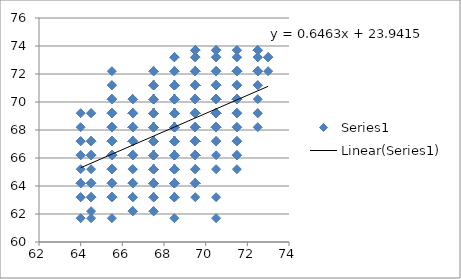
| Category | Series 0 |
|---|---|
| 70.5 | 61.7 |
| 68.5 | 61.7 |
| 65.5 | 61.7 |
| 64.5 | 61.7 |
| 64.0 | 61.7 |
| 67.5 | 62.2 |
| 67.5 | 62.2 |
| 67.5 | 62.2 |
| 66.5 | 62.2 |
| 66.5 | 62.2 |
| 66.5 | 62.2 |
| 64.5 | 62.2 |
| 70.5 | 63.2 |
| 69.5 | 63.2 |
| 68.5 | 63.2 |
| 68.5 | 63.2 |
| 68.5 | 63.2 |
| 68.5 | 63.2 |
| 68.5 | 63.2 |
| 68.5 | 63.2 |
| 68.5 | 63.2 |
| 67.5 | 63.2 |
| 67.5 | 63.2 |
| 67.5 | 63.2 |
| 67.5 | 63.2 |
| 67.5 | 63.2 |
| 66.5 | 63.2 |
| 66.5 | 63.2 |
| 66.5 | 63.2 |
| 65.5 | 63.2 |
| 65.5 | 63.2 |
| 65.5 | 63.2 |
| 65.5 | 63.2 |
| 65.5 | 63.2 |
| 65.5 | 63.2 |
| 65.5 | 63.2 |
| 65.5 | 63.2 |
| 65.5 | 63.2 |
| 64.5 | 63.2 |
| 64.5 | 63.2 |
| 64.5 | 63.2 |
| 64.5 | 63.2 |
| 64.0 | 63.2 |
| 64.0 | 63.2 |
| 69.5 | 64.2 |
| 69.5 | 64.2 |
| 69.5 | 64.2 |
| 69.5 | 64.2 |
| 69.5 | 64.2 |
| 69.5 | 64.2 |
| 69.5 | 64.2 |
| 69.5 | 64.2 |
| 69.5 | 64.2 |
| 69.5 | 64.2 |
| 69.5 | 64.2 |
| 69.5 | 64.2 |
| 69.5 | 64.2 |
| 69.5 | 64.2 |
| 69.5 | 64.2 |
| 69.5 | 64.2 |
| 68.5 | 64.2 |
| 68.5 | 64.2 |
| 68.5 | 64.2 |
| 68.5 | 64.2 |
| 68.5 | 64.2 |
| 68.5 | 64.2 |
| 68.5 | 64.2 |
| 68.5 | 64.2 |
| 68.5 | 64.2 |
| 68.5 | 64.2 |
| 68.5 | 64.2 |
| 67.5 | 64.2 |
| 67.5 | 64.2 |
| 67.5 | 64.2 |
| 67.5 | 64.2 |
| 67.5 | 64.2 |
| 67.5 | 64.2 |
| 67.5 | 64.2 |
| 67.5 | 64.2 |
| 67.5 | 64.2 |
| 67.5 | 64.2 |
| 67.5 | 64.2 |
| 67.5 | 64.2 |
| 67.5 | 64.2 |
| 67.5 | 64.2 |
| 66.5 | 64.2 |
| 66.5 | 64.2 |
| 66.5 | 64.2 |
| 66.5 | 64.2 |
| 66.5 | 64.2 |
| 65.5 | 64.2 |
| 65.5 | 64.2 |
| 65.5 | 64.2 |
| 65.5 | 64.2 |
| 65.5 | 64.2 |
| 64.5 | 64.2 |
| 64.5 | 64.2 |
| 64.5 | 64.2 |
| 64.5 | 64.2 |
| 64.0 | 64.2 |
| 64.0 | 64.2 |
| 64.0 | 64.2 |
| 64.0 | 64.2 |
| 71.5 | 65.2 |
| 70.5 | 65.2 |
| 69.5 | 65.2 |
| 69.5 | 65.2 |
| 69.5 | 65.2 |
| 69.5 | 65.2 |
| 68.5 | 65.2 |
| 68.5 | 65.2 |
| 68.5 | 65.2 |
| 68.5 | 65.2 |
| 68.5 | 65.2 |
| 68.5 | 65.2 |
| 68.5 | 65.2 |
| 68.5 | 65.2 |
| 68.5 | 65.2 |
| 68.5 | 65.2 |
| 68.5 | 65.2 |
| 68.5 | 65.2 |
| 68.5 | 65.2 |
| 68.5 | 65.2 |
| 68.5 | 65.2 |
| 68.5 | 65.2 |
| 67.5 | 65.2 |
| 67.5 | 65.2 |
| 67.5 | 65.2 |
| 67.5 | 65.2 |
| 67.5 | 65.2 |
| 67.5 | 65.2 |
| 67.5 | 65.2 |
| 67.5 | 65.2 |
| 67.5 | 65.2 |
| 67.5 | 65.2 |
| 67.5 | 65.2 |
| 67.5 | 65.2 |
| 67.5 | 65.2 |
| 67.5 | 65.2 |
| 67.5 | 65.2 |
| 66.5 | 65.2 |
| 66.5 | 65.2 |
| 65.5 | 65.2 |
| 65.5 | 65.2 |
| 65.5 | 65.2 |
| 65.5 | 65.2 |
| 65.5 | 65.2 |
| 65.5 | 65.2 |
| 65.5 | 65.2 |
| 64.5 | 65.2 |
| 64.0 | 65.2 |
| 71.5 | 66.2 |
| 71.5 | 66.2 |
| 71.5 | 66.2 |
| 70.5 | 66.2 |
| 69.5 | 66.2 |
| 69.5 | 66.2 |
| 69.5 | 66.2 |
| 69.5 | 66.2 |
| 69.5 | 66.2 |
| 69.5 | 66.2 |
| 69.5 | 66.2 |
| 69.5 | 66.2 |
| 69.5 | 66.2 |
| 69.5 | 66.2 |
| 69.5 | 66.2 |
| 69.5 | 66.2 |
| 69.5 | 66.2 |
| 69.5 | 66.2 |
| 69.5 | 66.2 |
| 69.5 | 66.2 |
| 69.5 | 66.2 |
| 68.5 | 66.2 |
| 68.5 | 66.2 |
| 68.5 | 66.2 |
| 68.5 | 66.2 |
| 68.5 | 66.2 |
| 68.5 | 66.2 |
| 68.5 | 66.2 |
| 68.5 | 66.2 |
| 68.5 | 66.2 |
| 68.5 | 66.2 |
| 68.5 | 66.2 |
| 68.5 | 66.2 |
| 68.5 | 66.2 |
| 68.5 | 66.2 |
| 68.5 | 66.2 |
| 68.5 | 66.2 |
| 68.5 | 66.2 |
| 68.5 | 66.2 |
| 68.5 | 66.2 |
| 68.5 | 66.2 |
| 68.5 | 66.2 |
| 68.5 | 66.2 |
| 68.5 | 66.2 |
| 68.5 | 66.2 |
| 68.5 | 66.2 |
| 67.5 | 66.2 |
| 67.5 | 66.2 |
| 67.5 | 66.2 |
| 67.5 | 66.2 |
| 67.5 | 66.2 |
| 67.5 | 66.2 |
| 67.5 | 66.2 |
| 67.5 | 66.2 |
| 67.5 | 66.2 |
| 67.5 | 66.2 |
| 67.5 | 66.2 |
| 67.5 | 66.2 |
| 67.5 | 66.2 |
| 67.5 | 66.2 |
| 67.5 | 66.2 |
| 67.5 | 66.2 |
| 67.5 | 66.2 |
| 67.5 | 66.2 |
| 67.5 | 66.2 |
| 67.5 | 66.2 |
| 67.5 | 66.2 |
| 67.5 | 66.2 |
| 67.5 | 66.2 |
| 67.5 | 66.2 |
| 67.5 | 66.2 |
| 67.5 | 66.2 |
| 67.5 | 66.2 |
| 67.5 | 66.2 |
| 67.5 | 66.2 |
| 67.5 | 66.2 |
| 67.5 | 66.2 |
| 67.5 | 66.2 |
| 67.5 | 66.2 |
| 67.5 | 66.2 |
| 67.5 | 66.2 |
| 67.5 | 66.2 |
| 66.5 | 66.2 |
| 66.5 | 66.2 |
| 66.5 | 66.2 |
| 66.5 | 66.2 |
| 66.5 | 66.2 |
| 66.5 | 66.2 |
| 66.5 | 66.2 |
| 66.5 | 66.2 |
| 66.5 | 66.2 |
| 66.5 | 66.2 |
| 66.5 | 66.2 |
| 66.5 | 66.2 |
| 66.5 | 66.2 |
| 66.5 | 66.2 |
| 66.5 | 66.2 |
| 66.5 | 66.2 |
| 66.5 | 66.2 |
| 65.5 | 66.2 |
| 65.5 | 66.2 |
| 65.5 | 66.2 |
| 65.5 | 66.2 |
| 65.5 | 66.2 |
| 65.5 | 66.2 |
| 65.5 | 66.2 |
| 65.5 | 66.2 |
| 65.5 | 66.2 |
| 65.5 | 66.2 |
| 65.5 | 66.2 |
| 64.5 | 66.2 |
| 64.5 | 66.2 |
| 64.5 | 66.2 |
| 64.5 | 66.2 |
| 64.5 | 66.2 |
| 64.0 | 66.2 |
| 64.0 | 66.2 |
| 71.5 | 67.2 |
| 71.5 | 67.2 |
| 71.5 | 67.2 |
| 71.5 | 67.2 |
| 70.5 | 67.2 |
| 70.5 | 67.2 |
| 70.5 | 67.2 |
| 69.5 | 67.2 |
| 69.5 | 67.2 |
| 69.5 | 67.2 |
| 69.5 | 67.2 |
| 69.5 | 67.2 |
| 69.5 | 67.2 |
| 69.5 | 67.2 |
| 69.5 | 67.2 |
| 69.5 | 67.2 |
| 69.5 | 67.2 |
| 69.5 | 67.2 |
| 69.5 | 67.2 |
| 69.5 | 67.2 |
| 69.5 | 67.2 |
| 69.5 | 67.2 |
| 69.5 | 67.2 |
| 69.5 | 67.2 |
| 69.5 | 67.2 |
| 69.5 | 67.2 |
| 69.5 | 67.2 |
| 69.5 | 67.2 |
| 69.5 | 67.2 |
| 69.5 | 67.2 |
| 69.5 | 67.2 |
| 69.5 | 67.2 |
| 69.5 | 67.2 |
| 69.5 | 67.2 |
| 68.5 | 67.2 |
| 68.5 | 67.2 |
| 68.5 | 67.2 |
| 68.5 | 67.2 |
| 68.5 | 67.2 |
| 68.5 | 67.2 |
| 68.5 | 67.2 |
| 68.5 | 67.2 |
| 68.5 | 67.2 |
| 68.5 | 67.2 |
| 68.5 | 67.2 |
| 68.5 | 67.2 |
| 68.5 | 67.2 |
| 68.5 | 67.2 |
| 68.5 | 67.2 |
| 68.5 | 67.2 |
| 68.5 | 67.2 |
| 68.5 | 67.2 |
| 68.5 | 67.2 |
| 68.5 | 67.2 |
| 68.5 | 67.2 |
| 68.5 | 67.2 |
| 68.5 | 67.2 |
| 68.5 | 67.2 |
| 68.5 | 67.2 |
| 68.5 | 67.2 |
| 68.5 | 67.2 |
| 68.5 | 67.2 |
| 68.5 | 67.2 |
| 68.5 | 67.2 |
| 68.5 | 67.2 |
| 67.5 | 67.2 |
| 67.5 | 67.2 |
| 67.5 | 67.2 |
| 67.5 | 67.2 |
| 67.5 | 67.2 |
| 67.5 | 67.2 |
| 67.5 | 67.2 |
| 67.5 | 67.2 |
| 67.5 | 67.2 |
| 67.5 | 67.2 |
| 67.5 | 67.2 |
| 67.5 | 67.2 |
| 67.5 | 67.2 |
| 67.5 | 67.2 |
| 67.5 | 67.2 |
| 67.5 | 67.2 |
| 67.5 | 67.2 |
| 67.5 | 67.2 |
| 67.5 | 67.2 |
| 67.5 | 67.2 |
| 67.5 | 67.2 |
| 67.5 | 67.2 |
| 67.5 | 67.2 |
| 67.5 | 67.2 |
| 67.5 | 67.2 |
| 67.5 | 67.2 |
| 67.5 | 67.2 |
| 67.5 | 67.2 |
| 67.5 | 67.2 |
| 67.5 | 67.2 |
| 67.5 | 67.2 |
| 67.5 | 67.2 |
| 67.5 | 67.2 |
| 67.5 | 67.2 |
| 67.5 | 67.2 |
| 67.5 | 67.2 |
| 67.5 | 67.2 |
| 67.5 | 67.2 |
| 66.5 | 67.2 |
| 66.5 | 67.2 |
| 66.5 | 67.2 |
| 66.5 | 67.2 |
| 66.5 | 67.2 |
| 66.5 | 67.2 |
| 66.5 | 67.2 |
| 66.5 | 67.2 |
| 66.5 | 67.2 |
| 66.5 | 67.2 |
| 66.5 | 67.2 |
| 66.5 | 67.2 |
| 66.5 | 67.2 |
| 66.5 | 67.2 |
| 66.5 | 67.2 |
| 66.5 | 67.2 |
| 66.5 | 67.2 |
| 65.5 | 67.2 |
| 65.5 | 67.2 |
| 65.5 | 67.2 |
| 65.5 | 67.2 |
| 65.5 | 67.2 |
| 65.5 | 67.2 |
| 65.5 | 67.2 |
| 65.5 | 67.2 |
| 65.5 | 67.2 |
| 65.5 | 67.2 |
| 65.5 | 67.2 |
| 64.5 | 67.2 |
| 64.5 | 67.2 |
| 64.5 | 67.2 |
| 64.5 | 67.2 |
| 64.5 | 67.2 |
| 64.0 | 67.2 |
| 64.0 | 67.2 |
| 72.5 | 68.2 |
| 71.5 | 68.2 |
| 71.5 | 68.2 |
| 71.5 | 68.2 |
| 70.5 | 68.2 |
| 70.5 | 68.2 |
| 70.5 | 68.2 |
| 70.5 | 68.2 |
| 70.5 | 68.2 |
| 70.5 | 68.2 |
| 70.5 | 68.2 |
| 70.5 | 68.2 |
| 70.5 | 68.2 |
| 70.5 | 68.2 |
| 70.5 | 68.2 |
| 70.5 | 68.2 |
| 69.5 | 68.2 |
| 69.5 | 68.2 |
| 69.5 | 68.2 |
| 69.5 | 68.2 |
| 69.5 | 68.2 |
| 69.5 | 68.2 |
| 69.5 | 68.2 |
| 69.5 | 68.2 |
| 69.5 | 68.2 |
| 69.5 | 68.2 |
| 69.5 | 68.2 |
| 69.5 | 68.2 |
| 69.5 | 68.2 |
| 69.5 | 68.2 |
| 69.5 | 68.2 |
| 69.5 | 68.2 |
| 69.5 | 68.2 |
| 69.5 | 68.2 |
| 69.5 | 68.2 |
| 69.5 | 68.2 |
| 68.5 | 68.2 |
| 68.5 | 68.2 |
| 68.5 | 68.2 |
| 68.5 | 68.2 |
| 68.5 | 68.2 |
| 68.5 | 68.2 |
| 68.5 | 68.2 |
| 68.5 | 68.2 |
| 68.5 | 68.2 |
| 68.5 | 68.2 |
| 68.5 | 68.2 |
| 68.5 | 68.2 |
| 68.5 | 68.2 |
| 68.5 | 68.2 |
| 68.5 | 68.2 |
| 68.5 | 68.2 |
| 68.5 | 68.2 |
| 68.5 | 68.2 |
| 68.5 | 68.2 |
| 68.5 | 68.2 |
| 68.5 | 68.2 |
| 68.5 | 68.2 |
| 68.5 | 68.2 |
| 68.5 | 68.2 |
| 68.5 | 68.2 |
| 68.5 | 68.2 |
| 68.5 | 68.2 |
| 68.5 | 68.2 |
| 68.5 | 68.2 |
| 68.5 | 68.2 |
| 68.5 | 68.2 |
| 68.5 | 68.2 |
| 68.5 | 68.2 |
| 68.5 | 68.2 |
| 67.5 | 68.2 |
| 67.5 | 68.2 |
| 67.5 | 68.2 |
| 67.5 | 68.2 |
| 67.5 | 68.2 |
| 67.5 | 68.2 |
| 67.5 | 68.2 |
| 67.5 | 68.2 |
| 67.5 | 68.2 |
| 67.5 | 68.2 |
| 67.5 | 68.2 |
| 67.5 | 68.2 |
| 67.5 | 68.2 |
| 67.5 | 68.2 |
| 67.5 | 68.2 |
| 67.5 | 68.2 |
| 67.5 | 68.2 |
| 67.5 | 68.2 |
| 67.5 | 68.2 |
| 67.5 | 68.2 |
| 67.5 | 68.2 |
| 67.5 | 68.2 |
| 67.5 | 68.2 |
| 67.5 | 68.2 |
| 67.5 | 68.2 |
| 67.5 | 68.2 |
| 67.5 | 68.2 |
| 67.5 | 68.2 |
| 66.5 | 68.2 |
| 66.5 | 68.2 |
| 66.5 | 68.2 |
| 66.5 | 68.2 |
| 66.5 | 68.2 |
| 66.5 | 68.2 |
| 66.5 | 68.2 |
| 66.5 | 68.2 |
| 66.5 | 68.2 |
| 66.5 | 68.2 |
| 66.5 | 68.2 |
| 66.5 | 68.2 |
| 66.5 | 68.2 |
| 66.5 | 68.2 |
| 65.5 | 68.2 |
| 65.5 | 68.2 |
| 65.5 | 68.2 |
| 65.5 | 68.2 |
| 65.5 | 68.2 |
| 65.5 | 68.2 |
| 65.5 | 68.2 |
| 64.0 | 68.2 |
| 72.5 | 69.2 |
| 72.5 | 69.2 |
| 71.5 | 69.2 |
| 71.5 | 69.2 |
| 71.5 | 69.2 |
| 71.5 | 69.2 |
| 71.5 | 69.2 |
| 70.5 | 69.2 |
| 70.5 | 69.2 |
| 70.5 | 69.2 |
| 70.5 | 69.2 |
| 70.5 | 69.2 |
| 70.5 | 69.2 |
| 70.5 | 69.2 |
| 70.5 | 69.2 |
| 70.5 | 69.2 |
| 70.5 | 69.2 |
| 70.5 | 69.2 |
| 70.5 | 69.2 |
| 70.5 | 69.2 |
| 70.5 | 69.2 |
| 70.5 | 69.2 |
| 70.5 | 69.2 |
| 70.5 | 69.2 |
| 70.5 | 69.2 |
| 69.5 | 69.2 |
| 69.5 | 69.2 |
| 69.5 | 69.2 |
| 69.5 | 69.2 |
| 69.5 | 69.2 |
| 69.5 | 69.2 |
| 69.5 | 69.2 |
| 69.5 | 69.2 |
| 69.5 | 69.2 |
| 69.5 | 69.2 |
| 69.5 | 69.2 |
| 69.5 | 69.2 |
| 69.5 | 69.2 |
| 69.5 | 69.2 |
| 69.5 | 69.2 |
| 69.5 | 69.2 |
| 69.5 | 69.2 |
| 69.5 | 69.2 |
| 69.5 | 69.2 |
| 69.5 | 69.2 |
| 69.5 | 69.2 |
| 69.5 | 69.2 |
| 69.5 | 69.2 |
| 69.5 | 69.2 |
| 69.5 | 69.2 |
| 69.5 | 69.2 |
| 69.5 | 69.2 |
| 69.5 | 69.2 |
| 69.5 | 69.2 |
| 69.5 | 69.2 |
| 69.5 | 69.2 |
| 69.5 | 69.2 |
| 69.5 | 69.2 |
| 68.5 | 69.2 |
| 68.5 | 69.2 |
| 68.5 | 69.2 |
| 68.5 | 69.2 |
| 68.5 | 69.2 |
| 68.5 | 69.2 |
| 68.5 | 69.2 |
| 68.5 | 69.2 |
| 68.5 | 69.2 |
| 68.5 | 69.2 |
| 68.5 | 69.2 |
| 68.5 | 69.2 |
| 68.5 | 69.2 |
| 68.5 | 69.2 |
| 68.5 | 69.2 |
| 68.5 | 69.2 |
| 68.5 | 69.2 |
| 68.5 | 69.2 |
| 68.5 | 69.2 |
| 68.5 | 69.2 |
| 68.5 | 69.2 |
| 68.5 | 69.2 |
| 68.5 | 69.2 |
| 68.5 | 69.2 |
| 68.5 | 69.2 |
| 68.5 | 69.2 |
| 68.5 | 69.2 |
| 68.5 | 69.2 |
| 68.5 | 69.2 |
| 68.5 | 69.2 |
| 68.5 | 69.2 |
| 68.5 | 69.2 |
| 68.5 | 69.2 |
| 68.5 | 69.2 |
| 68.5 | 69.2 |
| 68.5 | 69.2 |
| 68.5 | 69.2 |
| 68.5 | 69.2 |
| 68.5 | 69.2 |
| 68.5 | 69.2 |
| 68.5 | 69.2 |
| 68.5 | 69.2 |
| 68.5 | 69.2 |
| 68.5 | 69.2 |
| 68.5 | 69.2 |
| 68.5 | 69.2 |
| 68.5 | 69.2 |
| 68.5 | 69.2 |
| 67.5 | 69.2 |
| 67.5 | 69.2 |
| 67.5 | 69.2 |
| 67.5 | 69.2 |
| 67.5 | 69.2 |
| 67.5 | 69.2 |
| 67.5 | 69.2 |
| 67.5 | 69.2 |
| 67.5 | 69.2 |
| 67.5 | 69.2 |
| 67.5 | 69.2 |
| 67.5 | 69.2 |
| 67.5 | 69.2 |
| 67.5 | 69.2 |
| 67.5 | 69.2 |
| 67.5 | 69.2 |
| 67.5 | 69.2 |
| 67.5 | 69.2 |
| 67.5 | 69.2 |
| 67.5 | 69.2 |
| 67.5 | 69.2 |
| 67.5 | 69.2 |
| 67.5 | 69.2 |
| 67.5 | 69.2 |
| 67.5 | 69.2 |
| 67.5 | 69.2 |
| 67.5 | 69.2 |
| 67.5 | 69.2 |
| 67.5 | 69.2 |
| 67.5 | 69.2 |
| 67.5 | 69.2 |
| 67.5 | 69.2 |
| 67.5 | 69.2 |
| 67.5 | 69.2 |
| 67.5 | 69.2 |
| 67.5 | 69.2 |
| 67.5 | 69.2 |
| 67.5 | 69.2 |
| 66.5 | 69.2 |
| 66.5 | 69.2 |
| 66.5 | 69.2 |
| 66.5 | 69.2 |
| 66.5 | 69.2 |
| 66.5 | 69.2 |
| 66.5 | 69.2 |
| 66.5 | 69.2 |
| 66.5 | 69.2 |
| 66.5 | 69.2 |
| 66.5 | 69.2 |
| 66.5 | 69.2 |
| 66.5 | 69.2 |
| 65.5 | 69.2 |
| 65.5 | 69.2 |
| 65.5 | 69.2 |
| 65.5 | 69.2 |
| 65.5 | 69.2 |
| 65.5 | 69.2 |
| 65.5 | 69.2 |
| 64.5 | 69.2 |
| 64.5 | 69.2 |
| 64.0 | 69.2 |
| 72.5 | 70.2 |
| 71.5 | 70.2 |
| 71.5 | 70.2 |
| 71.5 | 70.2 |
| 71.5 | 70.2 |
| 71.5 | 70.2 |
| 71.5 | 70.2 |
| 71.5 | 70.2 |
| 71.5 | 70.2 |
| 71.5 | 70.2 |
| 71.5 | 70.2 |
| 70.5 | 70.2 |
| 70.5 | 70.2 |
| 70.5 | 70.2 |
| 70.5 | 70.2 |
| 70.5 | 70.2 |
| 70.5 | 70.2 |
| 70.5 | 70.2 |
| 70.5 | 70.2 |
| 70.5 | 70.2 |
| 70.5 | 70.2 |
| 70.5 | 70.2 |
| 70.5 | 70.2 |
| 70.5 | 70.2 |
| 70.5 | 70.2 |
| 69.5 | 70.2 |
| 69.5 | 70.2 |
| 69.5 | 70.2 |
| 69.5 | 70.2 |
| 69.5 | 70.2 |
| 69.5 | 70.2 |
| 69.5 | 70.2 |
| 69.5 | 70.2 |
| 69.5 | 70.2 |
| 69.5 | 70.2 |
| 69.5 | 70.2 |
| 69.5 | 70.2 |
| 69.5 | 70.2 |
| 69.5 | 70.2 |
| 69.5 | 70.2 |
| 69.5 | 70.2 |
| 69.5 | 70.2 |
| 69.5 | 70.2 |
| 69.5 | 70.2 |
| 69.5 | 70.2 |
| 69.5 | 70.2 |
| 69.5 | 70.2 |
| 69.5 | 70.2 |
| 69.5 | 70.2 |
| 69.5 | 70.2 |
| 68.5 | 70.2 |
| 68.5 | 70.2 |
| 68.5 | 70.2 |
| 68.5 | 70.2 |
| 68.5 | 70.2 |
| 68.5 | 70.2 |
| 68.5 | 70.2 |
| 68.5 | 70.2 |
| 68.5 | 70.2 |
| 68.5 | 70.2 |
| 68.5 | 70.2 |
| 68.5 | 70.2 |
| 68.5 | 70.2 |
| 68.5 | 70.2 |
| 68.5 | 70.2 |
| 68.5 | 70.2 |
| 68.5 | 70.2 |
| 68.5 | 70.2 |
| 68.5 | 70.2 |
| 68.5 | 70.2 |
| 68.5 | 70.2 |
| 67.5 | 70.2 |
| 67.5 | 70.2 |
| 67.5 | 70.2 |
| 67.5 | 70.2 |
| 67.5 | 70.2 |
| 67.5 | 70.2 |
| 67.5 | 70.2 |
| 67.5 | 70.2 |
| 67.5 | 70.2 |
| 67.5 | 70.2 |
| 67.5 | 70.2 |
| 67.5 | 70.2 |
| 67.5 | 70.2 |
| 67.5 | 70.2 |
| 67.5 | 70.2 |
| 67.5 | 70.2 |
| 67.5 | 70.2 |
| 67.5 | 70.2 |
| 67.5 | 70.2 |
| 66.5 | 70.2 |
| 66.5 | 70.2 |
| 66.5 | 70.2 |
| 66.5 | 70.2 |
| 65.5 | 70.2 |
| 65.5 | 70.2 |
| 65.5 | 70.2 |
| 65.5 | 70.2 |
| 65.5 | 70.2 |
| 72.5 | 71.2 |
| 72.5 | 71.2 |
| 71.5 | 71.2 |
| 71.5 | 71.2 |
| 71.5 | 71.2 |
| 71.5 | 71.2 |
| 70.5 | 71.2 |
| 70.5 | 71.2 |
| 70.5 | 71.2 |
| 70.5 | 71.2 |
| 70.5 | 71.2 |
| 70.5 | 71.2 |
| 70.5 | 71.2 |
| 69.5 | 71.2 |
| 69.5 | 71.2 |
| 69.5 | 71.2 |
| 69.5 | 71.2 |
| 69.5 | 71.2 |
| 69.5 | 71.2 |
| 69.5 | 71.2 |
| 69.5 | 71.2 |
| 69.5 | 71.2 |
| 69.5 | 71.2 |
| 69.5 | 71.2 |
| 69.5 | 71.2 |
| 69.5 | 71.2 |
| 69.5 | 71.2 |
| 69.5 | 71.2 |
| 69.5 | 71.2 |
| 69.5 | 71.2 |
| 69.5 | 71.2 |
| 69.5 | 71.2 |
| 69.5 | 71.2 |
| 68.5 | 71.2 |
| 68.5 | 71.2 |
| 68.5 | 71.2 |
| 68.5 | 71.2 |
| 68.5 | 71.2 |
| 68.5 | 71.2 |
| 68.5 | 71.2 |
| 68.5 | 71.2 |
| 68.5 | 71.2 |
| 68.5 | 71.2 |
| 68.5 | 71.2 |
| 68.5 | 71.2 |
| 68.5 | 71.2 |
| 68.5 | 71.2 |
| 68.5 | 71.2 |
| 68.5 | 71.2 |
| 68.5 | 71.2 |
| 68.5 | 71.2 |
| 67.5 | 71.2 |
| 67.5 | 71.2 |
| 67.5 | 71.2 |
| 67.5 | 71.2 |
| 67.5 | 71.2 |
| 67.5 | 71.2 |
| 67.5 | 71.2 |
| 67.5 | 71.2 |
| 67.5 | 71.2 |
| 67.5 | 71.2 |
| 67.5 | 71.2 |
| 65.5 | 71.2 |
| 65.5 | 71.2 |
| 73.0 | 72.2 |
| 72.5 | 72.2 |
| 72.5 | 72.2 |
| 72.5 | 72.2 |
| 72.5 | 72.2 |
| 72.5 | 72.2 |
| 72.5 | 72.2 |
| 72.5 | 72.2 |
| 71.5 | 72.2 |
| 71.5 | 72.2 |
| 71.5 | 72.2 |
| 71.5 | 72.2 |
| 71.5 | 72.2 |
| 71.5 | 72.2 |
| 71.5 | 72.2 |
| 71.5 | 72.2 |
| 71.5 | 72.2 |
| 70.5 | 72.2 |
| 70.5 | 72.2 |
| 70.5 | 72.2 |
| 70.5 | 72.2 |
| 69.5 | 72.2 |
| 69.5 | 72.2 |
| 69.5 | 72.2 |
| 69.5 | 72.2 |
| 69.5 | 72.2 |
| 69.5 | 72.2 |
| 69.5 | 72.2 |
| 69.5 | 72.2 |
| 69.5 | 72.2 |
| 69.5 | 72.2 |
| 69.5 | 72.2 |
| 68.5 | 72.2 |
| 68.5 | 72.2 |
| 68.5 | 72.2 |
| 68.5 | 72.2 |
| 67.5 | 72.2 |
| 67.5 | 72.2 |
| 67.5 | 72.2 |
| 67.5 | 72.2 |
| 65.5 | 72.2 |
| 73.0 | 73.2 |
| 73.0 | 73.2 |
| 73.0 | 73.2 |
| 72.5 | 73.2 |
| 72.5 | 73.2 |
| 71.5 | 73.2 |
| 71.5 | 73.2 |
| 70.5 | 73.2 |
| 70.5 | 73.2 |
| 70.5 | 73.2 |
| 69.5 | 73.2 |
| 69.5 | 73.2 |
| 69.5 | 73.2 |
| 69.5 | 73.2 |
| 68.5 | 73.2 |
| 68.5 | 73.2 |
| 68.5 | 73.2 |
| 72.5 | 73.7 |
| 72.5 | 73.7 |
| 72.5 | 73.7 |
| 72.5 | 73.7 |
| 71.5 | 73.7 |
| 71.5 | 73.7 |
| 70.5 | 73.7 |
| 70.5 | 73.7 |
| 70.5 | 73.7 |
| 69.5 | 73.7 |
| 69.5 | 73.7 |
| 69.5 | 73.7 |
| 69.5 | 73.7 |
| 69.5 | 73.7 |